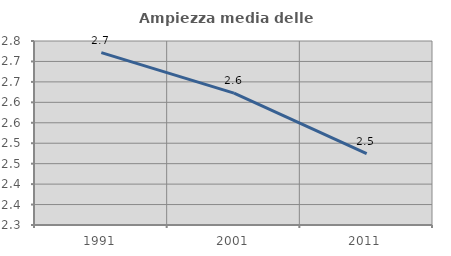
| Category | Ampiezza media delle famiglie |
|---|---|
| 1991.0 | 2.722 |
| 2001.0 | 2.623 |
| 2011.0 | 2.474 |